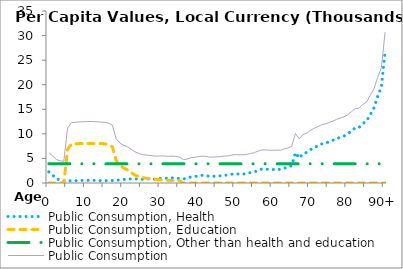
| Category | Public Consumption, Health | Public Consumption, Education | Public Consumption, Other than health and education | Public Consumption |
|---|---|---|---|---|
| 0 | 2268.92 | 0 | 3910.356 | 6179.276 |
|  | 1600.625 | 0 | 3910.356 | 5510.98 |
| 2 | 867.423 | 0 | 3910.356 | 4777.779 |
| 3 | 616.796 | 0 | 3910.356 | 4527.152 |
| 4 | 500.933 | 0 | 3910.356 | 4411.289 |
| 5 | 472.789 | 6788.315 | 3910.356 | 11171.46 |
| 6 | 439.196 | 7918.271 | 3910.356 | 12267.82 |
| 7 | 444.878 | 7990.579 | 3910.356 | 12345.81 |
| 8 | 504.626 | 8011.413 | 3910.356 | 12426.4 |
| 9 | 525.573 | 8027.345 | 3910.356 | 12463.27 |
| 10 | 536.705 | 8037.149 | 3910.356 | 12484.21 |
| 11 | 559.224 | 8046.954 | 3910.356 | 12516.53 |
| 12 | 545.602 | 8039.601 | 3910.356 | 12495.56 |
| 13 | 493.699 | 8033.473 | 3910.356 | 12437.53 |
| 14 | 474.885 | 8021.217 | 3910.356 | 12406.46 |
| 15 | 475.166 | 7959.94 | 3910.356 | 12345.46 |
| 16 | 470.001 | 7771.206 | 3910.356 | 12151.56 |
| 17 | 492.292 | 7382.707 | 3910.356 | 11785.35 |
| 18 | 537.057 | 4597.034 | 3910.356 | 9044.446 |
| 19 | 646.394 | 3563.896 | 3910.356 | 8120.646 |
| 20 | 726.894 | 3061.421 | 3910.356 | 7698.671 |
| 21 | 806.939 | 2672.922 | 3910.356 | 7390.217 |
| 22 | 830.842 | 2145.031 | 3910.356 | 6886.229 |
| 23 | 847.496 | 1626.303 | 3910.356 | 6384.155 |
| 24 | 792.916 | 1344.427 | 3910.356 | 6047.699 |
| 25 | 754.288 | 1123.828 | 3910.356 | 5788.472 |
| 26 | 806.373 | 985.341 | 3910.356 | 5702.07 |
| 27 | 835.849 | 876.268 | 3910.356 | 5622.473 |
| 28 | 784.492 | 800.283 | 3910.356 | 5495.131 |
| 29 | 843.534 | 719.397 | 3910.356 | 5473.288 |
| 30 | 947.947 | 645.864 | 3910.356 | 5504.167 |
| 31 | 979.901 | 601.47 | 3910.356 | 5491.727 |
| 32 | 959.694 | 563.752 | 3910.356 | 5433.803 |
| 33 | 1047.906 | 509.828 | 3910.356 | 5468.091 |
| 34 | 1020.709 | 485.062 | 3910.356 | 5416.127 |
| 35 | 895.814 | 451.002 | 3910.356 | 5257.171 |
| 36 | 849.649 | 0 | 3910.356 | 4760.005 |
| 37 | 956.531 | 0 | 3910.356 | 4866.887 |
| 38 | 1242.475 | 0 | 3910.356 | 5152.831 |
| 39 | 1330.668 | 0 | 3910.356 | 5241.024 |
| 40 | 1417.921 | 0 | 3910.356 | 5328.276 |
| 41 | 1558.834 | 0 | 3910.356 | 5469.19 |
| 42 | 1498.813 | 0 | 3910.356 | 5409.169 |
| 43 | 1351.507 | 0 | 3910.356 | 5261.863 |
| 44 | 1353.473 | 0 | 3910.356 | 5263.829 |
| 45 | 1430.825 | 0 | 3910.356 | 5341.182 |
| 46 | 1461.665 | 0 | 3910.356 | 5372.021 |
| 47 | 1589.285 | 0 | 3910.356 | 5499.642 |
| 48 | 1600.662 | 0 | 3910.356 | 5511.019 |
| 49 | 1799.977 | 0 | 3910.356 | 5710.333 |
| 50 | 1855.136 | 0 | 3910.356 | 5765.492 |
| 51 | 1827.806 | 0 | 3910.356 | 5738.162 |
| 52 | 1824.257 | 0 | 3910.356 | 5734.613 |
| 53 | 1928.837 | 0 | 3910.356 | 5839.193 |
| 54 | 2109.049 | 0 | 3910.356 | 6019.405 |
| 55 | 2249.079 | 0 | 3910.356 | 6159.435 |
| 56 | 2590.388 | 0 | 3910.356 | 6500.744 |
| 57 | 2836.979 | 0 | 3910.356 | 6747.335 |
| 58 | 2825.424 | 0 | 3910.356 | 6735.779 |
| 59 | 2776.416 | 0 | 3910.356 | 6686.771 |
| 60 | 2743.661 | 0 | 3910.356 | 6654.017 |
| 61 | 2798.899 | 0 | 3910.356 | 6709.255 |
| 62 | 2747.906 | 0 | 3910.356 | 6658.262 |
| 63 | 3020.375 | 0 | 3910.356 | 6930.731 |
| 64 | 3202.281 | 0 | 3910.356 | 7112.637 |
| 65 | 3559.594 | 0 | 3910.356 | 7469.95 |
| 66 | 6191.571 | 0 | 3910.356 | 10101.93 |
| 67 | 5068.001 | 0 | 3910.356 | 8978.357 |
| 68 | 5942.263 | 0 | 3910.356 | 9852.619 |
| 69 | 6217.489 | 0 | 3910.356 | 10127.85 |
| 70 | 6778.21 | 0 | 3910.356 | 10688.57 |
| 71 | 7234.781 | 0 | 3910.356 | 11145.14 |
| 72 | 7551.79 | 0 | 3910.356 | 11462.15 |
| 73 | 7950.779 | 0 | 3910.356 | 11861.13 |
| 74 | 8108.242 | 0 | 3910.356 | 12018.6 |
| 75 | 8379.498 | 0 | 3910.356 | 12289.85 |
| 76 | 8687.271 | 0 | 3910.356 | 12597.63 |
| 77 | 9025.358 | 0 | 3910.356 | 12935.71 |
| 78 | 9297.802 | 0 | 3910.356 | 13208.16 |
| 79 | 9558.223 | 0 | 3910.356 | 13468.58 |
| 80 | 9985.679 | 0 | 3910.356 | 13896.04 |
| 81 | 10621.45 | 0 | 3910.356 | 14531.8 |
| 82 | 11212.74 | 0 | 3910.356 | 15123.1 |
| 83 | 11290.67 | 0 | 3910.356 | 15201.03 |
| 84 | 12087.76 | 0 | 3910.356 | 15998.12 |
| 85 | 12538.56 | 0 | 3910.356 | 16448.92 |
| 86 | 13891.83 | 0 | 3910.356 | 17802.18 |
| 87 | 15259.85 | 0 | 3910.356 | 19170.21 |
| 88 | 17594.95 | 0 | 3910.356 | 21505.31 |
| 89 | 19546.05 | 0 | 3910.356 | 23456.41 |
| 90+ | 26821.14 | 0 | 3910.356 | 30731.5 |